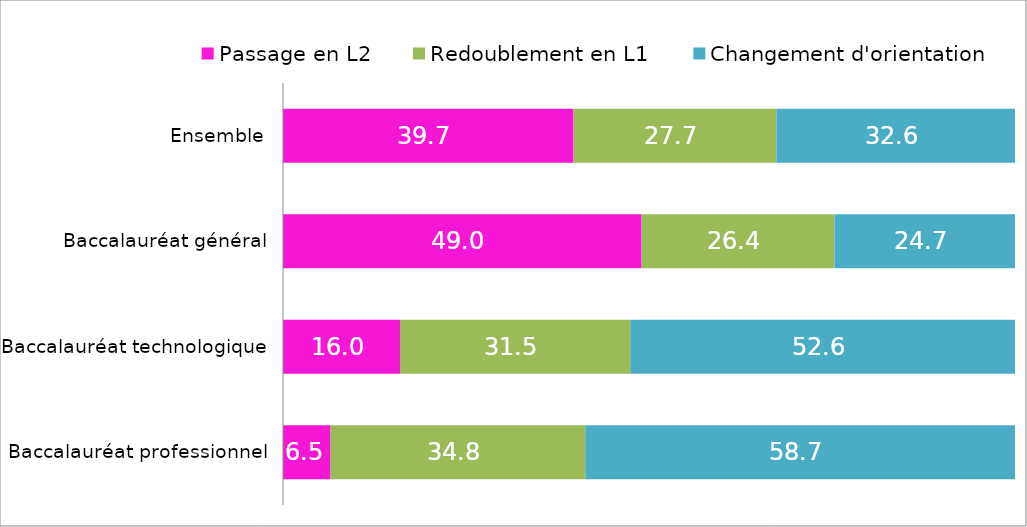
| Category | Passage en L2 | Redoublement en L1 | Changement d'orientation |
|---|---|---|---|
| Baccalauréat professionnel | 6.5 | 34.8 | 58.7 |
| Baccalauréat technologique | 15.989 | 31.454 | 52.557 |
| Baccalauréat général | 48.987 | 26.358 | 24.656 |
| Ensemble | 39.7 | 27.7 | 32.6 |